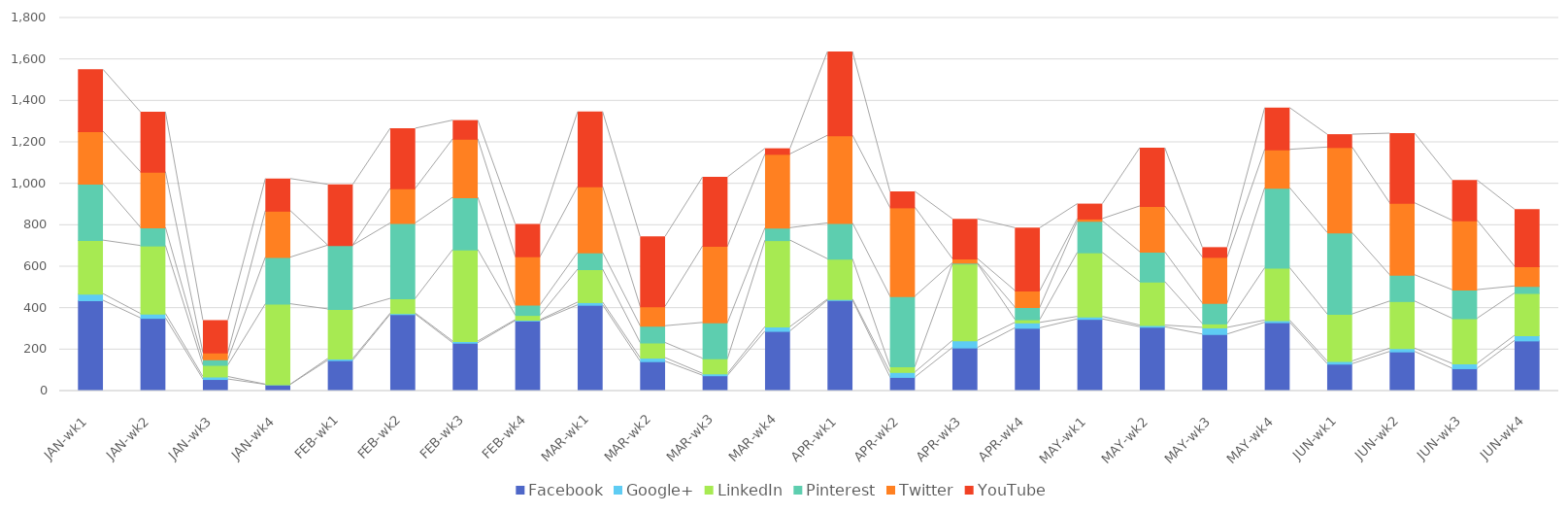
| Category | Facebook | Google+ | LinkedIn | Pinterest | Twitter | YouTube |
|---|---|---|---|---|---|---|
| JAN-wk1 | 436 | 32 | 258 | 272 | 254 | 298 |
| JAN-wk2 | 351 | 21 | 328 | 88 | 268 | 289 |
| JAN-wk3 | 56 | 12 | 56 | 27 | 33 | 156 |
| JAN-wk4 | 30 | 1 | 388 | 225 | 224 | 155 |
| FEB-wk1 | 147 | 8 | 239 | 308 | 0 | 293 |
| FEB-wk2 | 369 | 5 | 71 | 364 | 167 | 290 |
| FEB-wk3 | 231 | 8 | 442 | 252 | 282 | 90 |
| FEB-wk4 | 338 | 4 | 23 | 50 | 233 | 156 |
| MAR-wk1 | 414 | 13 | 159 | 81 | 318 | 361 |
| MAR-wk2 | 142 | 17 | 73 | 81 | 94 | 337 |
| MAR-wk3 | 74 | 9 | 73 | 173 | 369 | 333 |
| MAR-wk4 | 288 | 21 | 417 | 60 | 356 | 27 |
| APR-wk1 | 437 | 5 | 194 | 173 | 423 | 404 |
| APR-wk2 | 66 | 24 | 27 | 339 | 428 | 77 |
| APR-wk3 | 208 | 34 | 371 | 4 | 20 | 192 |
| APR-wk4 | 303 | 26 | 15 | 59 | 80 | 303 |
| MAY-wk1 | 346 | 12 | 309 | 152 | 11 | 72 |
| MAY-wk2 | 308 | 8 | 210 | 144 | 221 | 281 |
| MAY-wk3 | 273 | 32 | 19 | 99 | 222 | 47 |
| MAY-wk4 | 330 | 10 | 253 | 386 | 185 | 201 |
| JUN-wk1 | 130 | 13 | 227 | 393 | 412 | 62 |
| JUN-wk2 | 189 | 16 | 227 | 127 | 347 | 336 |
| JUN-wk3 | 108 | 23 | 218 | 138 | 335 | 194 |
| JUN-wk4 | 242 | 25 | 204 | 34 | 95 | 275 |